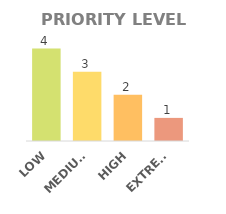
| Category | QTY |
|---|---|
| LOW | 4 |
| MEDIUM | 3 |
| HIGH | 2 |
| EXTREME | 1 |